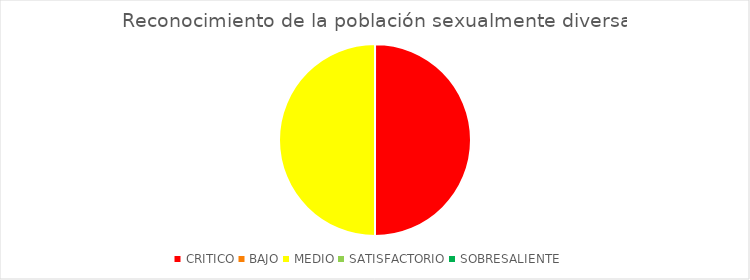
| Category | Reconocimiento de la población sexualmente diversa |
|---|---|
| CRITICO | 1 |
| BAJO | 0 |
| MEDIO | 1 |
| SATISFACTORIO | 0 |
| SOBRESALIENTE | 0 |